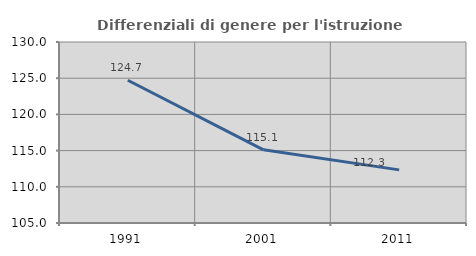
| Category | Differenziali di genere per l'istruzione superiore |
|---|---|
| 1991.0 | 124.718 |
| 2001.0 | 115.109 |
| 2011.0 | 112.339 |